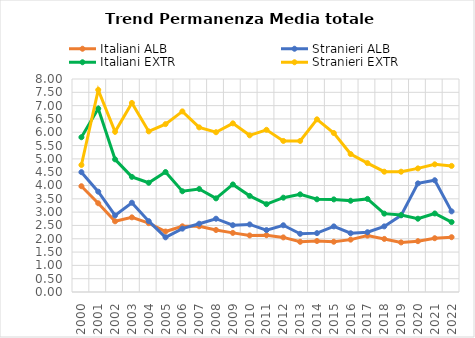
| Category | Italiani ALB | Stranieri ALB | Italiani EXTR | Stranieri EXTR |
|---|---|---|---|---|
| 2000.0 | 3.973 | 4.5 | 5.813 | 4.771 |
| 2001.0 | 3.333 | 3.769 | 6.889 | 7.59 |
| 2002.0 | 2.655 | 2.876 | 4.983 | 6.017 |
| 2003.0 | 2.804 | 3.353 | 4.325 | 7.101 |
| 2004.0 | 2.586 | 2.661 | 4.102 | 6.032 |
| 2005.0 | 2.271 | 2.053 | 4.506 | 6.306 |
| 2006.0 | 2.467 | 2.379 | 3.784 | 6.783 |
| 2007.0 | 2.469 | 2.564 | 3.87 | 6.183 |
| 2008.0 | 2.329 | 2.753 | 3.517 | 6.001 |
| 2009.0 | 2.22 | 2.51 | 4.039 | 6.334 |
| 2010.0 | 2.124 | 2.538 | 3.611 | 5.884 |
| 2011.0 | 2.132 | 2.326 | 3.298 | 6.092 |
| 2012.0 | 2.051 | 2.506 | 3.543 | 5.674 |
| 2013.0 | 1.885 | 2.186 | 3.667 | 5.674 |
| 2014.0 | 1.916 | 2.211 | 3.482 | 6.485 |
| 2015.0 | 1.888 | 2.464 | 3.478 | 5.971 |
| 2016.0 | 1.967 | 2.207 | 3.427 | 5.182 |
| 2017.0 | 2.118 | 2.245 | 3.496 | 4.842 |
| 2018.0 | 1.994 | 2.464 | 2.944 | 4.518 |
| 2019.0 | 1.862 | 2.879 | 2.889 | 4.518 |
| 2020.0 | 1.909 | 4.079 | 2.753 | 4.643 |
| 2021.0 | 2.02 | 4.197 | 2.949 | 4.795 |
| 2022.0 | 2.058 | 3.028 | 2.627 | 4.736 |